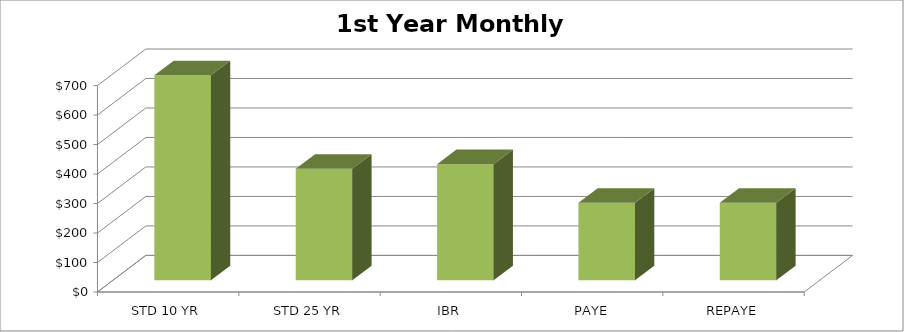
| Category | 1st Year Monthly Payment: |
|---|---|
| STD 10 YR | 695 |
| STD 25 YR | 378 |
| IBR | 394 |
| PAYE | 263 |
| REPAYE | 263 |